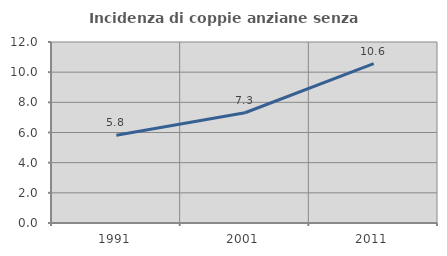
| Category | Incidenza di coppie anziane senza figli  |
|---|---|
| 1991.0 | 5.824 |
| 2001.0 | 7.309 |
| 2011.0 | 10.569 |